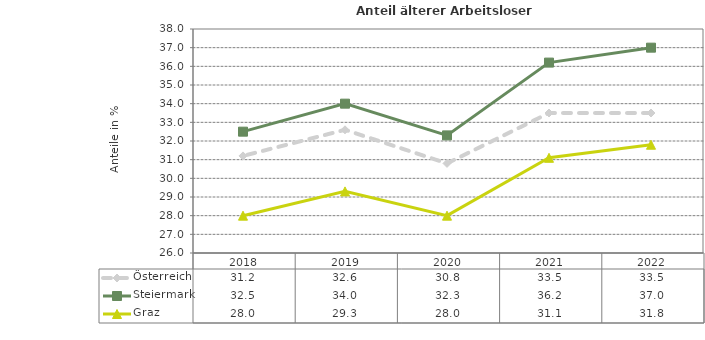
| Category | Österreich | Steiermark | Graz |
|---|---|---|---|
| 2022.0 | 33.5 | 37 | 31.8 |
| 2021.0 | 33.5 | 36.2 | 31.1 |
| 2020.0 | 30.8 | 32.3 | 28 |
| 2019.0 | 32.6 | 34 | 29.3 |
| 2018.0 | 31.2 | 32.5 | 28 |